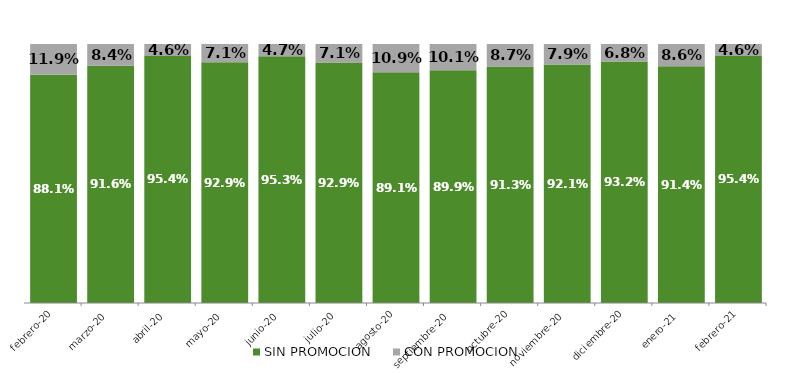
| Category | SIN PROMOCION   | CON PROMOCION   |
|---|---|---|
| 2020-02-01 | 0.881 | 0.119 |
| 2020-03-01 | 0.916 | 0.084 |
| 2020-04-01 | 0.954 | 0.046 |
| 2020-05-01 | 0.929 | 0.071 |
| 2020-06-01 | 0.953 | 0.047 |
| 2020-07-01 | 0.929 | 0.071 |
| 2020-08-01 | 0.891 | 0.109 |
| 2020-09-01 | 0.899 | 0.101 |
| 2020-10-01 | 0.913 | 0.087 |
| 2020-11-01 | 0.921 | 0.079 |
| 2020-12-01 | 0.932 | 0.068 |
| 2021-01-01 | 0.914 | 0.086 |
| 2021-02-01 | 0.954 | 0.046 |